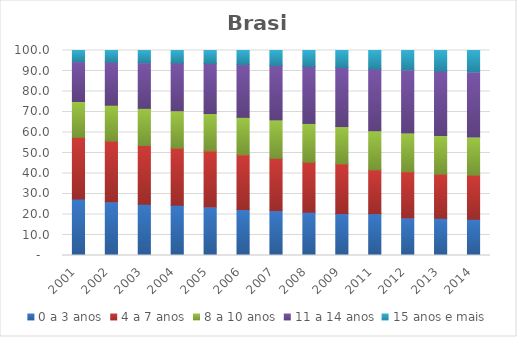
| Category | 0 a 3 anos | 4 a 7 anos | 8 a 10 anos | 11 a 14 anos | 15 anos e mais |
|---|---|---|---|---|---|
| 2001.0 | 27.54 | 30.11 | 17.47 | 19.45 | 5.44 |
| 2002.0 | 26.2 | 29.62 | 17.5 | 20.99 | 5.7 |
| 2003.0 | 25.01 | 28.66 | 18.12 | 22.25 | 5.96 |
| 2004.0 | 24.53 | 27.83 | 18.24 | 23.25 | 6.16 |
| 2005.0 | 23.66 | 27.45 | 18.13 | 24.43 | 6.33 |
| 2006.0 | 22.41 | 26.77 | 18.22 | 25.75 | 6.86 |
| 2007.0 | 21.89 | 25.51 | 18.71 | 26.6 | 7.29 |
| 2008.0 | 21.11 | 24.4 | 18.92 | 27.8 | 7.76 |
| 2009.0 | 20.42 | 24.37 | 18.12 | 28.77 | 8.32 |
| 2011.0 | 20.41 | 21.47 | 18.95 | 30.13 | 9.04 |
| 2012.0 | 18.34 | 22.57 | 18.9 | 30.76 | 9.43 |
| 2013.0 | 18.16 | 21.54 | 18.88 | 31.4 | 10.02 |
| 2014.0 | 17.65 | 21.57 | 18.6 | 31.71 | 10.47 |